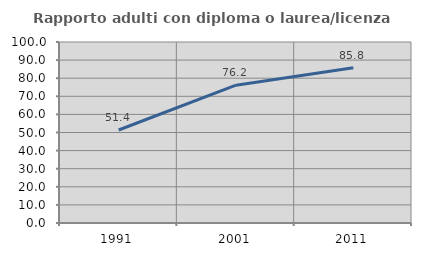
| Category | Rapporto adulti con diploma o laurea/licenza media  |
|---|---|
| 1991.0 | 51.371 |
| 2001.0 | 76.163 |
| 2011.0 | 85.791 |